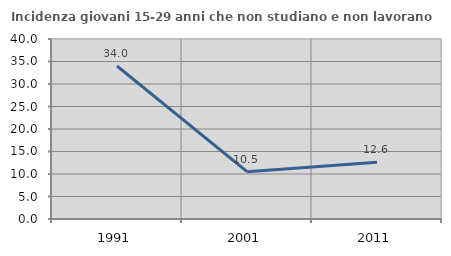
| Category | Incidenza giovani 15-29 anni che non studiano e non lavorano  |
|---|---|
| 1991.0 | 33.994 |
| 2001.0 | 10.526 |
| 2011.0 | 12.618 |